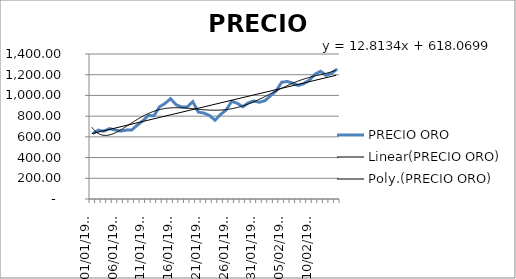
| Category | PRECIO ORO |
|---|---|
| 01/01/1900 | 631.17 |
| 02/01/1900 | 664.75 |
| 03/01/1900 | 654.9 |
| 04/01/1900 | 679.37 |
| 05/01/1900 | 666.86 |
| 06/01/1900 | 655.49 |
| 07/01/1900 | 665.3 |
| 08/01/1900 | 665.41 |
| 09/01/1900 | 712.65 |
| 10/01/1900 | 754.6 |
| 11/01/1900 | 806.25 |
| 12/01/1900 | 803.2 |
| 13/01/1900 | 889.6 |
| 14/01/1900 | 922.3 |
| 15/01/1900 | 968.43 |
| 16/01/1900 | 909.7 |
| 17/01/1900 | 888.66 |
| 18/01/1900 | 889.49 |
| 19/01/1900 | 939.77 |
| 20/01/1900 | 839.02 |
| 21/01/1900 | 829.93 |
| 22/01/1900 | 806.62 |
| 23/01/1900 | 760.86 |
| 24/01/1900 | 816.19 |
| 25/01/1900 | 858.69 |
| 26/01/1900 | 943.16 |
| 27/01/1900 | 924.27 |
| 28/01/1900 | 890.2 |
| 29/01/1900 | 928.64 |
| 30/01/1900 | 945.67 |
| 31/01/1900 | 934.23 |
| 01/02/1900 | 949.38 |
| 02/02/1900 | 996.59 |
| 03/02/1900 | 1043.16 |
| 04/02/1900 | 1127.04 |
| 05/02/1900 | 1134.72 |
| 06/02/1900 | 1117.96 |
| 07/02/1900 | 1095.41 |
| 08/02/1900 | 1113.94 |
| 09/02/1900 | 1148.69 |
| 10/02/1900 | 1205.43 |
| 11/02/1900 | 1232.92 |
| 12/02/1900 | 1192.97 |
| 13/02/1900 | 1215.81 |
| 14/02/1900 | 1255.63 |